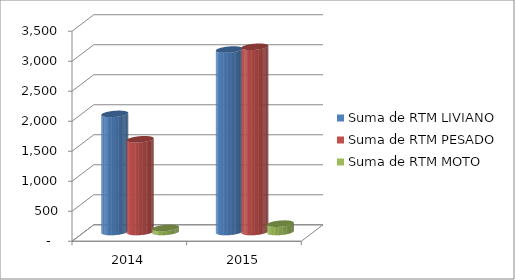
| Category | Suma de RTM LIVIANO | Suma de RTM PESADO | Suma de RTM MOTO |
|---|---|---|---|
| 2014 | 1968 | 1545 | 67 |
| 2015 | 3040 | 3086 | 139 |